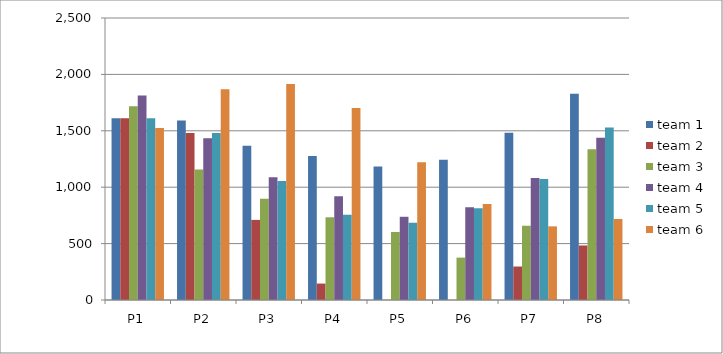
| Category | team 1 | team 2 | team 3 | team 4 | team 5 | team 6 |
|---|---|---|---|---|---|---|
| P1 | 1610.902 | 1610.902 | 1718.531 | 1812.092 | 1610.902 | 1525.794 |
| P2 | 1590.98 | 1480.929 | 1157.546 | 1433.387 | 1480.929 | 1868.988 |
| P3 | 1368.343 | 710.059 | 897.929 | 1088.235 | 1055.031 | 1915.094 |
| P4 | 1276.471 | 145.588 | 733.333 | 919.643 | 756.25 | 1701.183 |
| P5 | 1183.105 | 0 | 603.133 | 737.713 | 684.862 | 1220.815 |
| P6 | 1243.169 | 0 | 375.767 | 822.404 | 812.842 | 851.093 |
| P7 | 1483.66 | 296.732 | 658.184 | 1081.961 | 1072.81 | 652.81 |
| P8 | 1828.463 | 483.392 | 1336.08 | 1437.929 | 1528.875 | 717.981 |